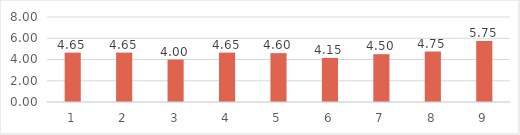
| Category | Series 0 |
|---|---|
| 0 | 4.65 |
| 1 | 4.65 |
| 2 | 4 |
| 3 | 4.65 |
| 4 | 4.6 |
| 5 | 4.15 |
| 6 | 4.5 |
| 7 | 4.75 |
| 8 | 5.75 |